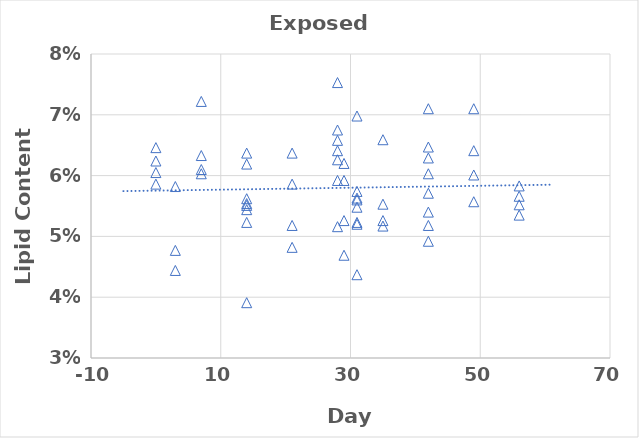
| Category | Exposed RBT |
|---|---|
| 3.0 | 0.048 |
| 3.0 | 0.058 |
| 3.0 | 0.044 |
| 7.0 | 0.063 |
| 7.0 | 0.061 |
| 7.0 | 0.072 |
| 7.0 | 0.06 |
| 14.0 | 0.062 |
| 14.0 | 0.055 |
| 14.0 | 0.056 |
| 14.0 | 0.052 |
| 14.0 | 0.054 |
| 14.0 | 0.064 |
| 14.0 | 0.039 |
| 14.0 | 0.055 |
| 21.0 | 0.052 |
| 21.0 | 0.059 |
| 21.0 | 0.064 |
| 21.0 | 0.048 |
| 28.0 | 0.068 |
| 28.0 | 0.052 |
| 28.0 | 0.075 |
| 28.0 | 0.064 |
| 28.0 | 0.063 |
| 28.0 | 0.059 |
| 28.0 | 0.066 |
| 29.0 | 0.047 |
| 29.0 | 0.062 |
| 29.0 | 0.053 |
| 29.0 | 0.059 |
| 31.0 | 0.057 |
| 31.0 | 0.07 |
| 31.0 | 0.052 |
| 31.0 | 0.044 |
| 31.0 | 0.056 |
| 31.0 | 0.056 |
| 31.0 | 0.055 |
| 31.0 | 0.052 |
| 35.0 | 0.052 |
| 35.0 | 0.053 |
| 35.0 | 0.055 |
| 35.0 | 0.066 |
| 42.0 | 0.052 |
| 42.0 | 0.071 |
| 42.0 | 0.054 |
| 42.0 | 0.065 |
| 42.0 | 0.06 |
| 42.0 | 0.049 |
| 42.0 | 0.057 |
| 42.0 | 0.063 |
| 49.0 | 0.06 |
| 49.0 | 0.056 |
| 49.0 | 0.071 |
| 49.0 | 0.064 |
| 56.0 | 0.055 |
| 56.0 | 0.057 |
| 56.0 | 0.058 |
| 56.0 | 0.054 |
| 0.0 | 0.059 |
| 0.0 | 0.065 |
| 0.0 | 0.062 |
| 0.0 | 0.06 |